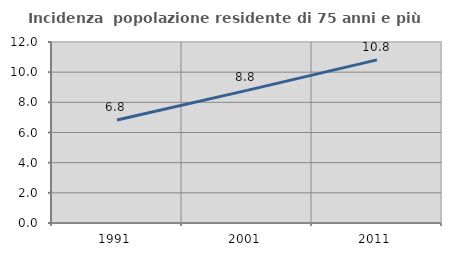
| Category | Incidenza  popolazione residente di 75 anni e più |
|---|---|
| 1991.0 | 6.826 |
| 2001.0 | 8.791 |
| 2011.0 | 10.813 |